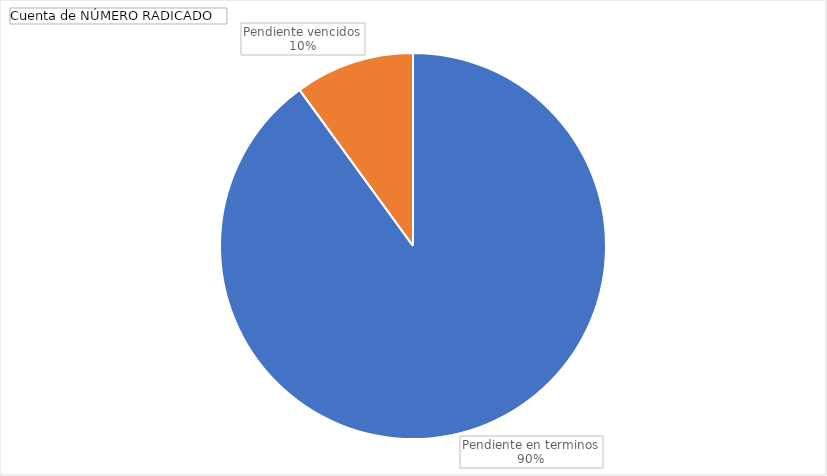
| Category | Total |
|---|---|
| Pendiente en terminos | 9 |
| Pendiente vencidos | 1 |